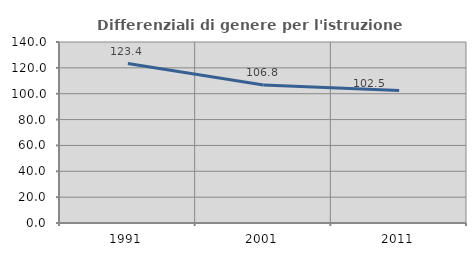
| Category | Differenziali di genere per l'istruzione superiore |
|---|---|
| 1991.0 | 123.358 |
| 2001.0 | 106.779 |
| 2011.0 | 102.528 |